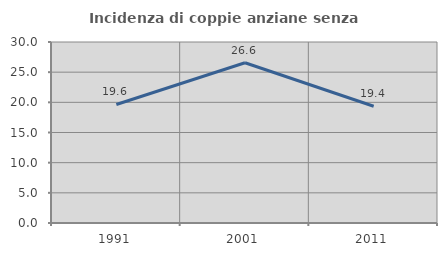
| Category | Incidenza di coppie anziane senza figli  |
|---|---|
| 1991.0 | 19.643 |
| 2001.0 | 26.562 |
| 2011.0 | 19.355 |